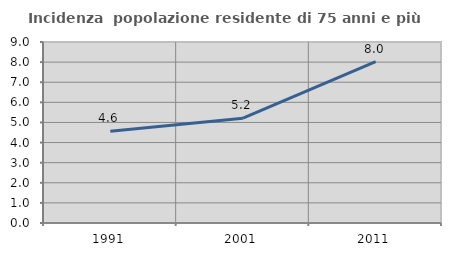
| Category | Incidenza  popolazione residente di 75 anni e più |
|---|---|
| 1991.0 | 4.568 |
| 2001.0 | 5.211 |
| 2011.0 | 8.022 |